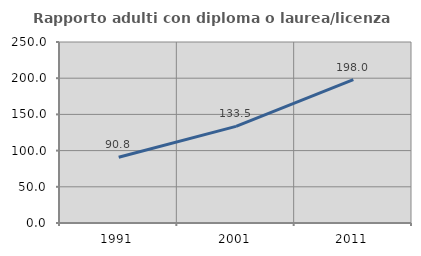
| Category | Rapporto adulti con diploma o laurea/licenza media  |
|---|---|
| 1991.0 | 90.813 |
| 2001.0 | 133.48 |
| 2011.0 | 198.023 |